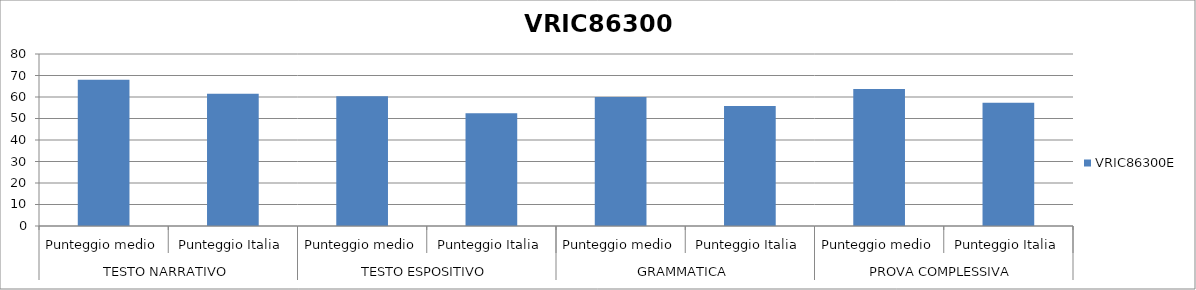
| Category | VRIC86300E |
|---|---|
| 0 | 68 |
| 1 | 61.5 |
| 2 | 60.3 |
| 3 | 52.4 |
| 4 | 60 |
| 5 | 55.8 |
| 6 | 63.7 |
| 7 | 57.3 |